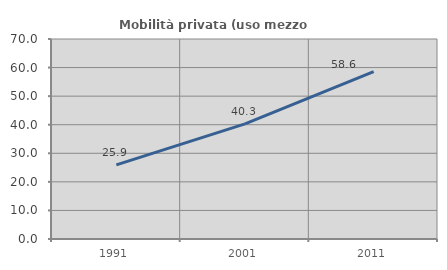
| Category | Mobilità privata (uso mezzo privato) |
|---|---|
| 1991.0 | 25.941 |
| 2001.0 | 40.281 |
| 2011.0 | 58.612 |